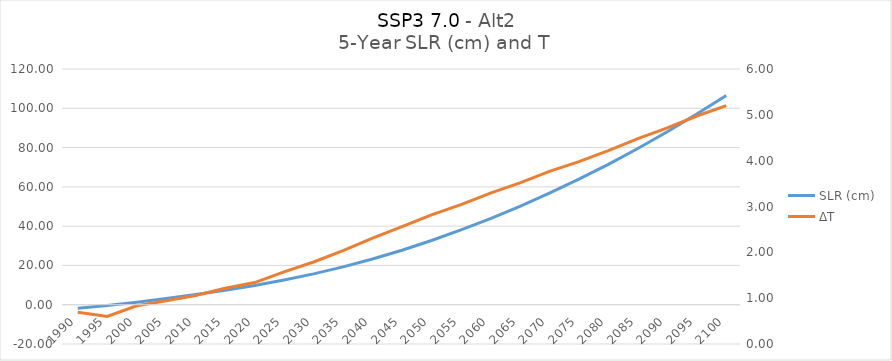
| Category | SLR (cm) |
|---|---|
| 1990.0 | -1.781 |
| 1995.0 | -0.455 |
| 2000.0 | 1.253 |
| 2005.0 | 3.132 |
| 2010.0 | 5.16 |
| 2015.0 | 7.412 |
| 2020.0 | 9.814 |
| 2025.0 | 12.59 |
| 2030.0 | 15.708 |
| 2035.0 | 19.253 |
| 2040.0 | 23.277 |
| 2045.0 | 27.751 |
| 2050.0 | 32.704 |
| 2055.0 | 38.053 |
| 2060.0 | 43.874 |
| 2065.0 | 50.101 |
| 2070.0 | 56.812 |
| 2075.0 | 63.907 |
| 2080.0 | 71.452 |
| 2085.0 | 79.513 |
| 2090.0 | 88.032 |
| 2095.0 | 97.064 |
| 2100.0 | 106.527 |